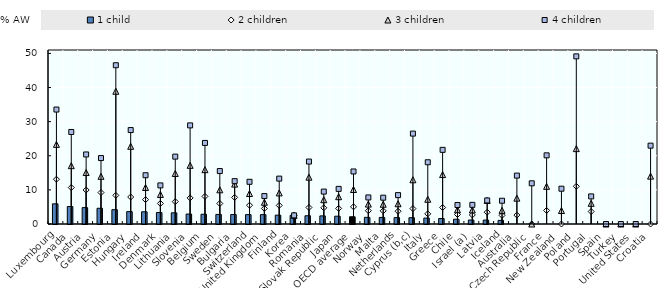
| Category | 1 child |
|---|---|
| Luxembourg | 5.916 |
| Canada | 5.133 |
| Austria | 4.802 |
| Germany | 4.611 |
| Estonia | 4.196 |
| Hungary | 3.632 |
| Ireland | 3.574 |
| Denmark | 3.366 |
| Lithuania | 3.278 |
| Slovenia | 2.922 |
| Belgium | 2.854 |
| Sweden | 2.803 |
| Bulgaria | 2.772 |
| Switzerland | 2.749 |
| United Kingdom | 2.742 |
| Finland | 2.593 |
| Korea | 2.534 |
| Romania | 2.418 |
| Slovak Republic | 2.375 |
| Japan | 2.287 |
| OECD average | 2.123 |
| Norway | 1.946 |
| Malta | 1.929 |
| Netherlands | 1.87 |
| Cyprus (b,c) | 1.846 |
| Italy | 1.735 |
| Greece | 1.61 |
| Chile | 1.393 |
| Israel (a) | 1.176 |
| Latvia | 1.152 |
| Iceland | 1.064 |
| Australia | 0 |
| Czech Republic | 0 |
| France | 0 |
| New Zealand | 0 |
| Poland | 0 |
| Portugal | 0 |
| Spain | 0 |
| Turkey | 0 |
| United States | 0 |
| Croatia | 0 |